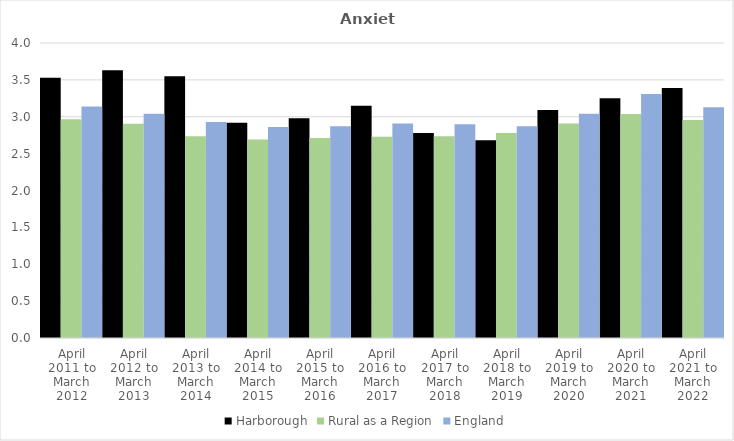
| Category | Harborough | Rural as a Region | England |
|---|---|---|---|
| April 2011 to March 2012 | 3.53 | 2.967 | 3.14 |
| April 2012 to March 2013 | 3.63 | 2.904 | 3.04 |
| April 2013 to March 2014 | 3.55 | 2.734 | 2.93 |
| April 2014 to March 2015 | 2.92 | 2.691 | 2.86 |
| April 2015 to March 2016 | 2.98 | 2.711 | 2.87 |
| April 2016 to March 2017 | 3.15 | 2.729 | 2.91 |
| April 2017 to March 2018 | 2.78 | 2.736 | 2.9 |
| April 2018 to March 2019 | 2.68 | 2.78 | 2.87 |
| April 2019 to March 2020 | 3.09 | 2.908 | 3.04 |
| April 2020 to March 2021 | 3.25 | 3.036 | 3.31 |
| April 2021 to March 2022 | 3.39 | 2.956 | 3.13 |